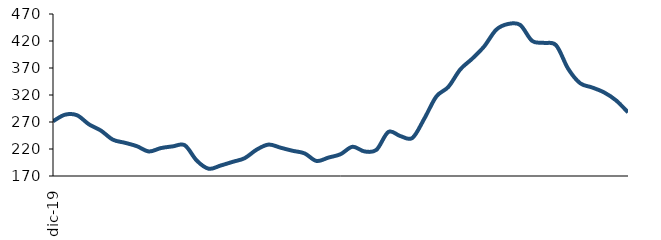
| Category | Series 0 |
|---|---|
| 2019-12-01 | 271.361 |
| 2020-01-01 | 283.496 |
| 2020-02-01 | 282.571 |
| 2020-03-01 | 265.686 |
| 2020-04-01 | 254.092 |
| 2020-05-01 | 237.244 |
| 2020-06-01 | 231.555 |
| 2020-07-01 | 225.236 |
| 2020-08-01 | 215.435 |
| 2020-09-01 | 221.664 |
| 2020-10-01 | 224.87 |
| 2020-11-01 | 226.946 |
| 2020-12-01 | 198.561 |
| 2021-01-01 | 183.435 |
| 2021-02-01 | 189.419 |
| 2021-03-01 | 196.21 |
| 2021-04-01 | 203.011 |
| 2021-05-01 | 218.776 |
| 2021-06-01 | 228.209 |
| 2021-07-01 | 222.41 |
| 2021-08-01 | 216.706 |
| 2021-09-01 | 211.912 |
| 2021-10-01 | 197.858 |
| 2021-11-01 | 204.149 |
| 2021-12-01 | 210.311 |
| 2022-01-01 | 224.106 |
| 2022-02-01 | 215.528 |
| 2022-03-01 | 218.49 |
| 2022-04-01 | 251.637 |
| 2022-05-01 | 243.929 |
| 2022-06-01 | 240.483 |
| 2022-07-01 | 276.323 |
| 2022-08-01 | 317.225 |
| 2022-09-01 | 334.931 |
| 2022-10-01 | 367.369 |
| 2022-11-01 | 387.357 |
| 2022-12-01 | 410.168 |
| 2023-01-01 | 440.878 |
| 2023-02-01 | 451.549 |
| 2023-03-01 | 449.723 |
| 2023-04-01 | 420.135 |
| 2023-05-01 | 416.476 |
| 2023-06-01 | 412.057 |
| 2023-07-01 | 368.841 |
| 2023-08-01 | 341.914 |
| 2023-09-01 | 333.963 |
| 2023-10-01 | 324.866 |
| 2023-11-01 | 310.077 |
| 2023-12-01 | 287.88 |